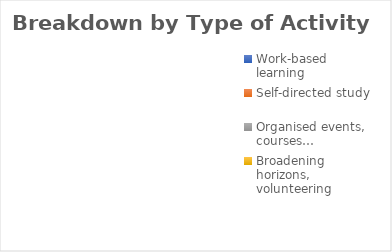
| Category | Breakdown by Type of Activity |
|---|---|
| Work-based learning | 0 |
| Self-directed study | 0 |
| Organised events, courses… | 0 |
| Broadening horizons, volunteering | 0 |